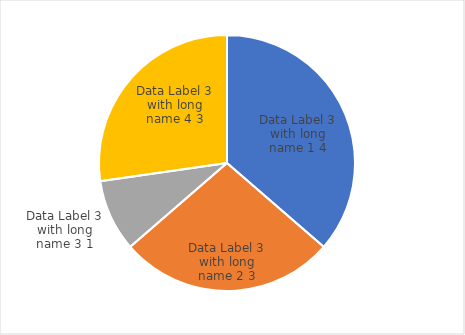
| Category | Series 0 |
|---|---|
| Data Label 3 with long name 1 | 4 |
| Data Label 3 with long name 2 | 3 |
| Data Label 3 with long name 3 | 1 |
| Data Label 3 with long name 4 | 3 |